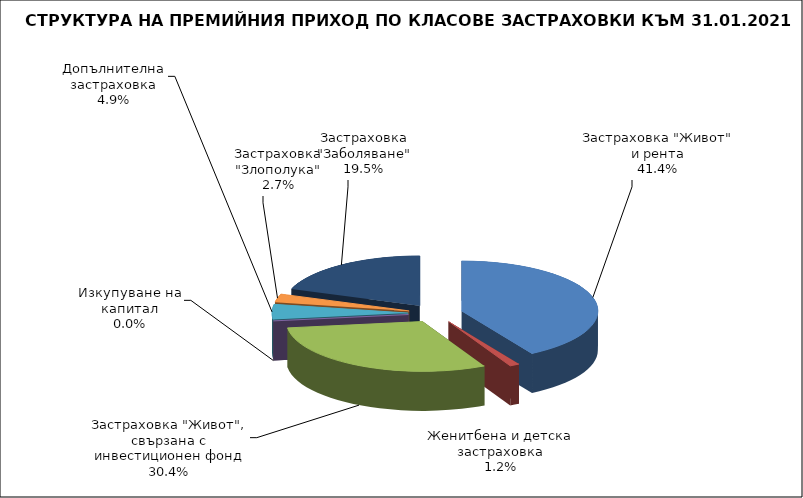
| Category | Series 0 |
|---|---|
| Застраховка "Живот" и рента | 22897092.39 |
| Женитбена и детска застраховка | 650805.307 |
| Застраховка "Живот", свързана с инвестиционен фонд | 16846899.917 |
| Изкупуване на капитал | 0 |
| Допълнителна застраховка | 2690266.071 |
| Застраховка "Злополука" | 1478218.81 |
| Застраховка "Заболяване" | 10805462.42 |